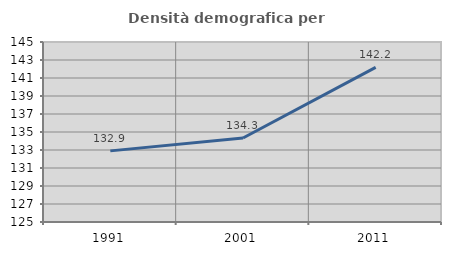
| Category | Densità demografica |
|---|---|
| 1991.0 | 132.902 |
| 2001.0 | 134.335 |
| 2011.0 | 142.18 |